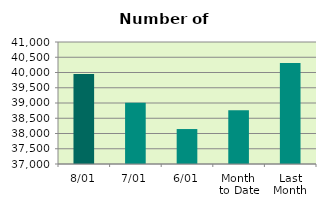
| Category | Series 0 |
|---|---|
| 8/01 | 39948 |
| 7/01 | 39008 |
| 6/01 | 38146 |
| Month 
to Date | 38764.8 |
| Last
Month | 40313.8 |